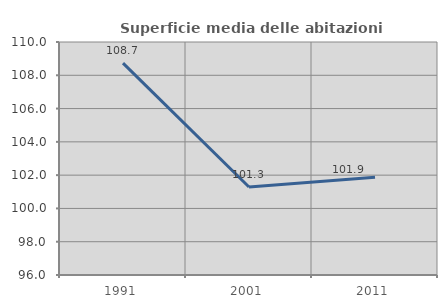
| Category | Superficie media delle abitazioni occupate |
|---|---|
| 1991.0 | 108.731 |
| 2001.0 | 101.289 |
| 2011.0 | 101.874 |